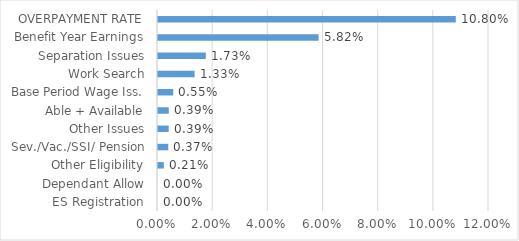
| Category | Series 0 |
|---|---|
| ES Registration | 0 |
| Dependant Allow | 0 |
| Other Eligibility | 0.002 |
| Sev./Vac./SSI/ Pension | 0.004 |
| Other Issues | 0.004 |
| Able + Available | 0.004 |
| Base Period Wage Iss. | 0.006 |
| Work Search | 0.013 |
| Separation Issues | 0.017 |
| Benefit Year Earnings | 0.058 |
| OVERPAYMENT RATE | 0.108 |